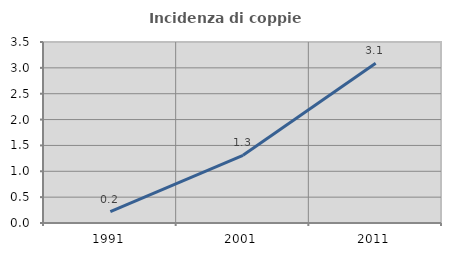
| Category | Incidenza di coppie miste |
|---|---|
| 1991.0 | 0.222 |
| 2001.0 | 1.308 |
| 2011.0 | 3.09 |